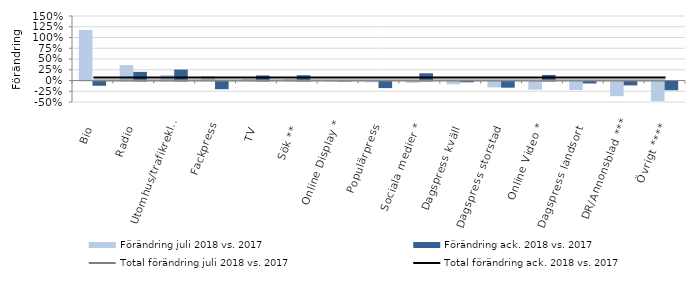
| Category | Förändring juli 2018 vs. 2017 | Förändring ack. 2018 vs. 2017 |
|---|---|---|
| Bio | 1.175 | -0.099 |
| Radio | 0.359 | 0.201 |
| Utomhus/trafikreklam | 0.124 | 0.254 |
| Fackpress | 0.097 | -0.18 |
| TV | 0.042 | 0.117 |
| Sök ** | 0.035 | 0.122 |
| Online Display * | 0.007 | 0.006 |
| Populärpress | -0.018 | -0.153 |
| Sociala medier * | -0.031 | 0.168 |
| Dagspress kväll  | -0.065 | -0.018 |
| Dagspress storstad  | -0.137 | -0.144 |
| Online Video * | -0.189 | 0.129 |
| Dagspress landsort  | -0.195 | -0.046 |
| DR/Annonsblad *** | -0.341 | -0.091 |
| Övrigt **** | -0.458 | -0.204 |